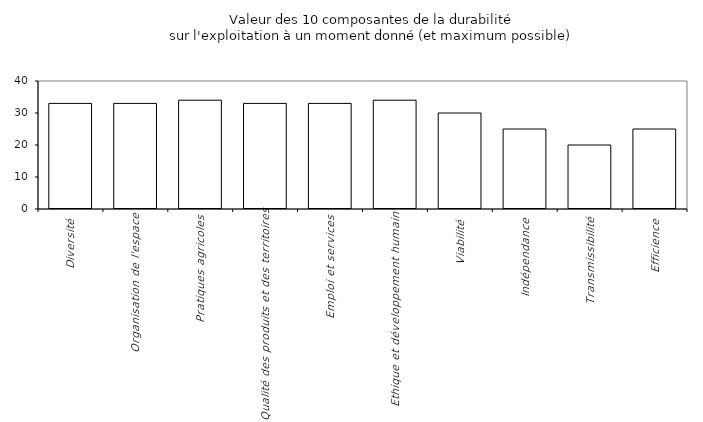
| Category | Score obtenu | Complément
au maximum |
|---|---|---|
| Diversité | 0 | 33 |
| Organisation de l'espace | 0 | 33 |
| Pratiques agricoles | 0 | 34 |
| Qualité des produits et des territoires | 0 | 33 |
| Emploi et services | 0 | 33 |
| Ethique et développement humain | 0 | 34 |
| Viabilité | 0 | 30 |
| Indépendance | 0 | 25 |
| Transmissibilité | 0 | 20 |
| Efficience | 0 | 25 |